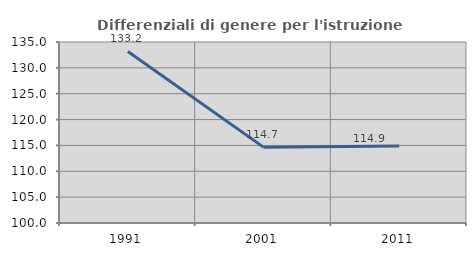
| Category | Differenziali di genere per l'istruzione superiore |
|---|---|
| 1991.0 | 133.168 |
| 2001.0 | 114.672 |
| 2011.0 | 114.904 |